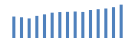
| Category | Exportações (1) |
|---|---|
| 0 | 595986.616 |
| 1 | 575965.577 |
| 2 | 544011.291 |
| 3 | 614380.205 |
| 4 | 656918.26 |
| 5 | 703504.835 |
| 6 | 720793.562 |
| 7 | 726284.803 |
| 8 | 735533.905 |
| 9 | 723973.625 |
| 10 | 778041 |
| 11 | 800341.537 |
| 12 | 819402.338 |
| 13 | 856189.676 |
| 14 | 926596.176 |